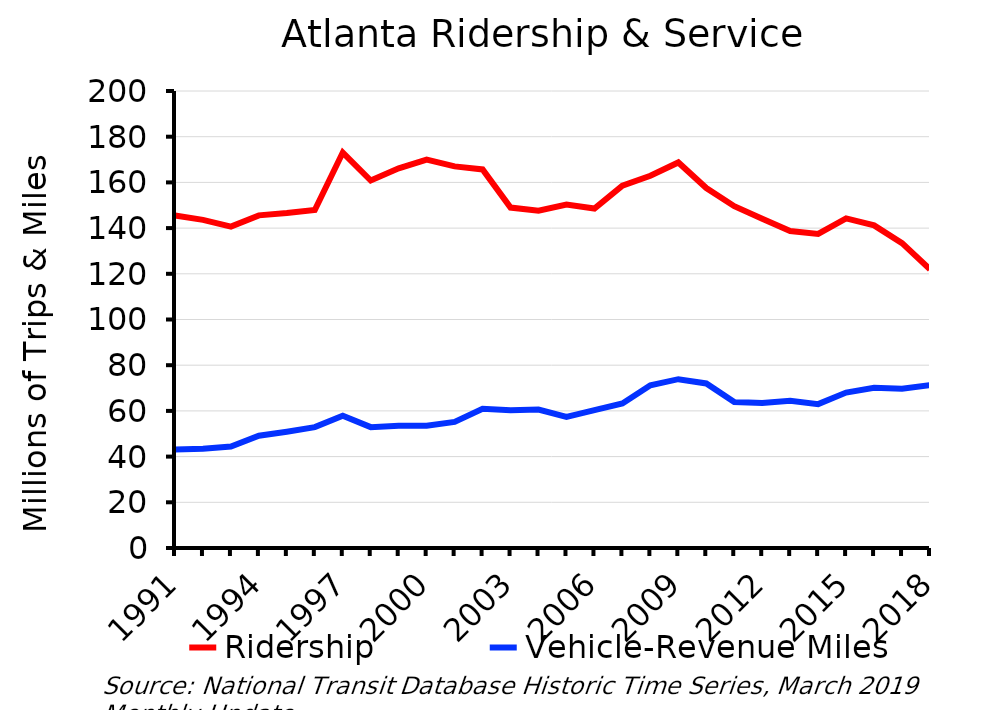
| Category | Ridership | Vehicle-Revenue Miles |
|---|---|---|
| 1991.0 | 145.535 | 43.153 |
| 1992.0 | 143.596 | 43.432 |
| 1993.0 | 140.647 | 44.396 |
| 1994.0 | 145.565 | 49.111 |
| 1995.0 | 146.6 | 50.881 |
| 1996.0 | 147.921 | 52.889 |
| 1997.0 | 173.063 | 57.913 |
| 1998.0 | 160.833 | 52.895 |
| 1999.0 | 166.158 | 53.501 |
| 2000.0 | 170.014 | 53.481 |
| 2001.0 | 167.014 | 55.157 |
| 2002.0 | 165.666 | 60.93 |
| 2003.0 | 148.977 | 60.272 |
| 2004.0 | 147.582 | 60.588 |
| 2005.0 | 150.283 | 57.404 |
| 2006.0 | 148.543 | 60.342 |
| 2007.0 | 158.549 | 63.247 |
| 2008.0 | 162.931 | 71.195 |
| 2009.0 | 168.74 | 73.881 |
| 2010.0 | 157.532 | 72.025 |
| 2011.0 | 149.573 | 63.888 |
| 2012.0 | 144.09 | 63.424 |
| 2013.0 | 138.696 | 64.482 |
| 2014.0 | 137.478 | 62.968 |
| 2015.0 | 144.218 | 68.023 |
| 2016.0 | 141.175 | 70.084 |
| 2017.0 | 133.429 | 69.673 |
| 2018.0 | 121.986 | 71.299 |